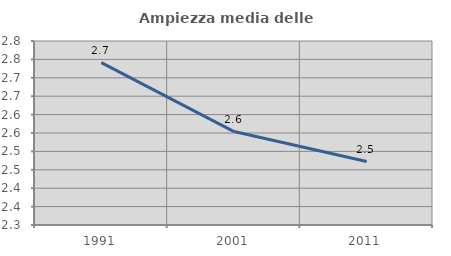
| Category | Ampiezza media delle famiglie |
|---|---|
| 1991.0 | 2.741 |
| 2001.0 | 2.554 |
| 2011.0 | 2.472 |